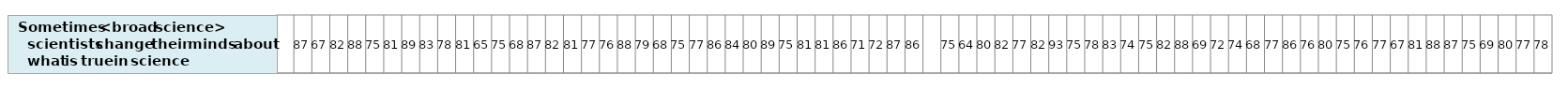
| Category | Sometimes <broad science>
scientists change their minds 
about what is true in science |
|---|---|
| nan | 1 |
| 87.25816970204481 | 1 |
| 67.14132433696227 | 1 |
| 81.57187313144738 | 1 |
| 88.05840731519233 | 1 |
| 74.85247921323068 | 1 |
| 81.43335197027685 | 1 |
| 88.92825343237054 | 1 |
| 82.87757908146165 | 1 |
| 77.91747499225033 | 1 |
| 80.72602733220641 | 1 |
| 65.33292198011242 | 1 |
| 74.85687270938955 | 1 |
| 67.83872488315671 | 1 |
| 86.53890598488286 | 1 |
| 81.56820905334433 | 1 |
| 80.61339563908523 | 1 |
| 76.57088552811041 | 1 |
| 76.34809160262873 | 1 |
| 87.88104203874727 | 1 |
| 78.72075566714209 | 1 |
| 67.77561808033296 | 1 |
| 75.11900933661997 | 1 |
| 77.2934126158764 | 1 |
| 86.48385458579413 | 1 |
| 83.748946305688 | 1 |
| 79.60715846209985 | 1 |
| 89.3680839758971 | 1 |
| 75.15999358580913 | 1 |
| 81.26339315541354 | 1 |
| 81.03157332695847 | 1 |
| 85.61170742205213 | 1 |
| 70.71609506731271 | 1 |
| 71.96728691445915 | 1 |
| 87.07354212440157 | 1 |
| 86.07497147785928 | 1 |
| nan | 1 |
| 75.40560552260203 | 1 |
| 63.90055252979234 | 1 |
| 79.72424328144058 | 1 |
| 82.14358847698861 | 1 |
| 77.3492190063076 | 1 |
| 82.29360221861967 | 1 |
| 93.45224721441728 | 1 |
| 74.63456783042898 | 1 |
| 77.97301944397356 | 1 |
| 83.38291804601162 | 1 |
| 73.9957654403377 | 1 |
| 75.26863916804082 | 1 |
| 82.07089208788972 | 1 |
| 88.3043883002643 | 1 |
| 69.44689159214245 | 1 |
| 71.74956899514348 | 1 |
| 74.31763920136414 | 1 |
| 68.21486320333715 | 1 |
| 77.49035118780586 | 1 |
| 85.96887889078043 | 1 |
| 75.64436790347833 | 1 |
| 80.43229892132668 | 1 |
| 74.65510546562402 | 1 |
| 76.2904140960421 | 1 |
| 76.7013406783224 | 1 |
| 66.66402375733864 | 1 |
| 80.55442073297692 | 1 |
| 87.5457874769524 | 1 |
| 87.00147439362397 | 1 |
| 74.86363783335229 | 1 |
| 69.44745942370224 | 1 |
| 80.42306808802444 | 1 |
| 77.35540021495548 | 1 |
| 77.91634059229708 | 1 |